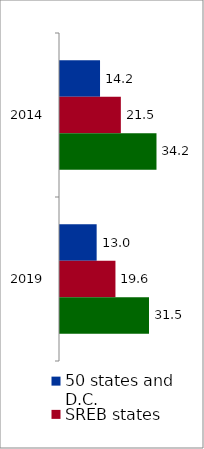
| Category | 50 states and D.C. | SREB states | State |
|---|---|---|---|
| 2014.0 | 14.169 | 21.54 | 34.154 |
| 2019.0 | 12.974 | 19.627 | 31.502 |